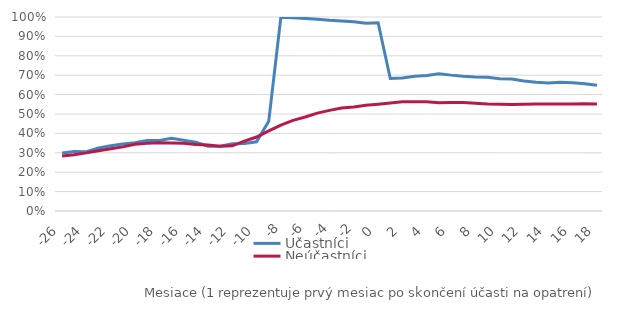
| Category | Účastníci | Neúčastníci |
|---|---|---|
| -26.0 | 0.299 | 0.283 |
| -25.0 | 0.307 | 0.29 |
| -24.0 | 0.305 | 0.3 |
| -23.0 | 0.325 | 0.311 |
| -22.0 | 0.336 | 0.321 |
| -21.0 | 0.345 | 0.33 |
| -20.0 | 0.352 | 0.344 |
| -19.0 | 0.364 | 0.349 |
| -18.0 | 0.363 | 0.352 |
| -17.0 | 0.374 | 0.35 |
| -16.0 | 0.365 | 0.349 |
| -15.0 | 0.355 | 0.342 |
| -14.0 | 0.334 | 0.34 |
| -13.0 | 0.334 | 0.334 |
| -12.0 | 0.346 | 0.336 |
| -11.0 | 0.348 | 0.36 |
| -10.0 | 0.357 | 0.381 |
| -9.0 | 0.462 | 0.413 |
| -8.0 | 0.999 | 0.442 |
| -7.0 | 0.996 | 0.468 |
| -6.0 | 0.993 | 0.484 |
| -5.0 | 0.988 | 0.505 |
| -4.0 | 0.983 | 0.519 |
| -3.0 | 0.98 | 0.531 |
| -2.0 | 0.975 | 0.536 |
| -1.0 | 0.967 | 0.545 |
| 0.0 | 0.97 | 0.55 |
| 1.0 | 0.683 | 0.556 |
| 2.0 | 0.685 | 0.563 |
| 3.0 | 0.694 | 0.564 |
| 4.0 | 0.698 | 0.563 |
| 5.0 | 0.708 | 0.558 |
| 6.0 | 0.7 | 0.559 |
| 7.0 | 0.694 | 0.559 |
| 8.0 | 0.691 | 0.555 |
| 9.0 | 0.69 | 0.551 |
| 10.0 | 0.682 | 0.55 |
| 11.0 | 0.68 | 0.549 |
| 12.0 | 0.67 | 0.55 |
| 13.0 | 0.664 | 0.551 |
| 14.0 | 0.66 | 0.552 |
| 15.0 | 0.664 | 0.552 |
| 16.0 | 0.661 | 0.552 |
| 17.0 | 0.656 | 0.553 |
| 18.0 | 0.649 | 0.552 |